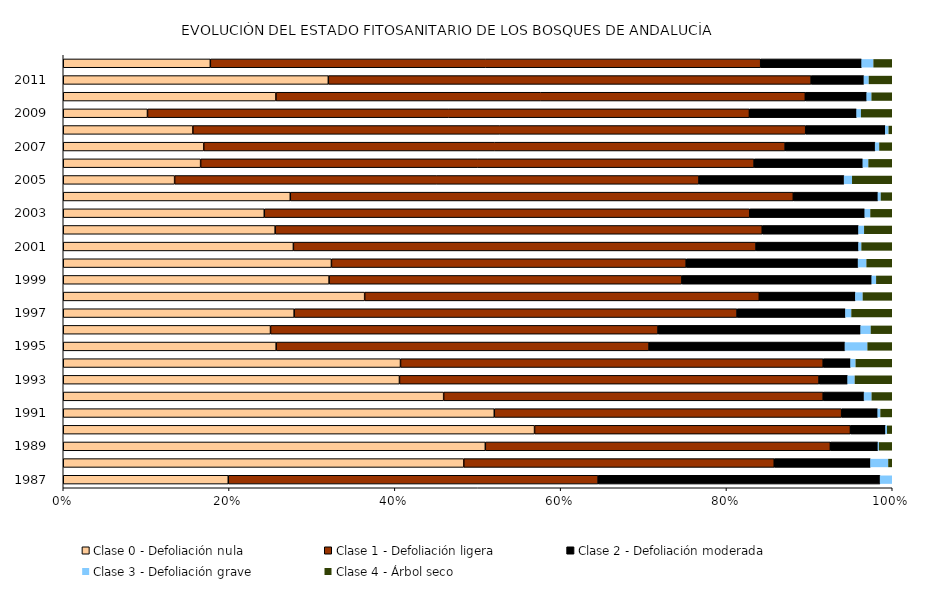
| Category | Clase 0 - Defoliación nula | Clase 1 - Defoliación ligera | Clase 2 - Defoliación moderada | Clase 3 - Defoliación grave | Clase 4 - Árbol seco |
|---|---|---|---|---|---|
| 1987.0 | 340 | 762 | 581 | 25 | 0 |
| 1988.0 | 845 | 655 | 203 | 38 | 8 |
| 1989.0 | 1002 | 819 | 113 | 3 | 31 |
| 1990.0 | 1037 | 695 | 77 | 4 | 11 |
| 1991.0 | 886 | 714 | 74 | 6 | 24 |
| 1992.0 | 837 | 835 | 90 | 17 | 45 |
| 1993.0 | 730 | 911 | 62 | 16 | 81 |
| 1994.0 | 703 | 881 | 57 | 11 | 76 |
| 1995.0 | 450 | 788 | 414 | 48 | 52 |
| 1996.0 | 438 | 819 | 428 | 22 | 45 |
| 1997.0 | 488 | 936 | 229 | 13 | 86 |
| 1998.0 | 637 | 834 | 203 | 16 | 62 |
| 1999.0 | 685 | 909 | 489 | 12 | 41 |
| 2000.0 | 691 | 914 | 443 | 22 | 66 |
| 2001.0 | 593 | 1192 | 264 | 8 | 79 |
| 2002.0 | 546 | 1255 | 248 | 15 | 72 |
| 2003.0 | 518 | 1251 | 296 | 15 | 56 |
| 2004.0 | 585 | 1296 | 218 | 8 | 29 |
| 2005.0 | 287 | 1351 | 374 | 21 | 103 |
| 2006.0 | 354 | 1426 | 280 | 15 | 61 |
| 2007.0 | 362 | 1498 | 232 | 11 | 33 |
| 2008.0 | 334 | 1579 | 205 | 9 | 9 |
| 2009.0 | 217 | 1551 | 276 | 12 | 80 |
| 2010.0 | 548 | 1364 | 158 | 13 | 53 |
| 2011.0 | 683 | 1244 | 136 | 13 | 60 |
| 2012.0 | 379 | 1418 | 260 | 31 | 48 |